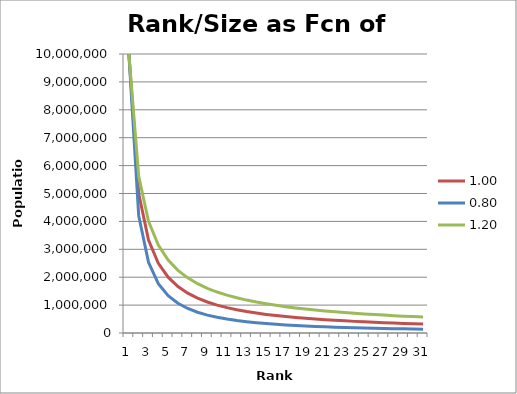
| Category | 1.00 | 0.80 | 1.20 |
|---|---|---|---|
| 0 | 10000000 | 10000000 | 10000000 |
| 1 | 5000000 | 4204482.076 | 5612310.242 |
| 2 | 3333333.333 | 2532785.619 | 4003123.184 |
| 3 | 2500000 | 1767766.953 | 3149802.625 |
| 4 | 2000000 | 1337480.61 | 2615320.972 |
| 5 | 1666666.667 | 1064905.174 | 2246676.924 |
| 6 | 1428571.429 | 878268.79 | 1975839.363 |
| 7 | 1250000 | 743254.447 | 1767766.953 |
| 8 | 1111111.111 | 641500.299 | 1602499.523 |
| 9 | 1000000 | 562341.325 | 1467799.268 |
| 10 | 909090.909 | 499182.261 | 1355728.614 |
| 11 | 833333.333 | 447737.472 | 1260904.791 |
| 12 | 769230.769 | 405107.991 | 1179543.259 |
| 13 | 714285.714 | 369266.539 | 1108902.349 |
| 14 | 666666.667 | 338755.165 | 1046945.202 |
| 15 | 625000 | 312500 | 992125.657 |
| 16 | 588235.294 | 289693.565 | 943248.013 |
| 17 | 555555.556 | 269717.651 | 899372.448 |
| 18 | 526315.789 | 252091.382 | 859749.633 |
| 19 | 500000 | 236435.402 | 823774.486 |
| 20 | 476190.476 | 222446.656 | 790952.836 |
| 21 | 454545.455 | 209880.287 | 760876.959 |
| 22 | 434782.609 | 198536.428 | 733207.339 |
| 23 | 416666.667 | 188250.417 | 707658.887 |
| 24 | 400000 | 178885.438 | 683990.379 |
| 25 | 384615.385 | 170326.929 | 661996.271 |
| 26 | 370370.37 | 162478.273 | 641500.299 |
| 27 | 357142.857 | 155257.454 | 622350.401 |
| 28 | 344827.586 | 148594.421 | 604414.677 |
| 29 | 333333.333 | 142429.002 | 587578.128 |
| 30 | 322580.645 | 136709.244 | 571740.015 |